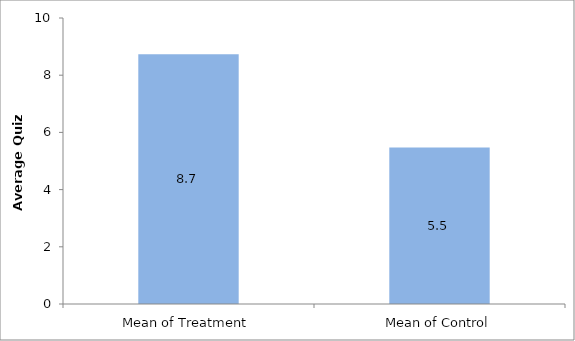
| Category | Series 0 |
|---|---|
| Mean of Treatment | 8.737 |
| Mean of Control | 5.474 |